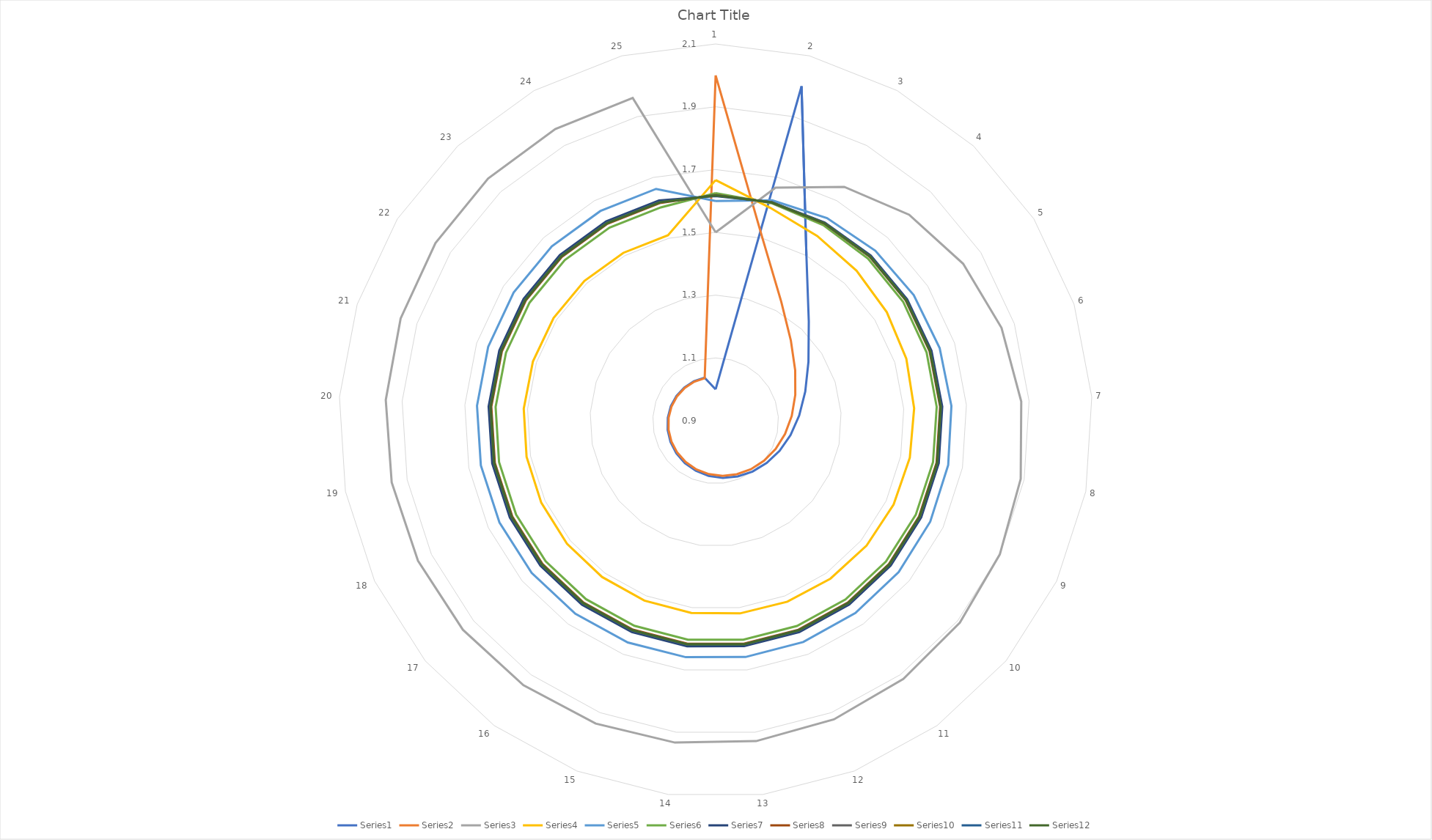
| Category | Series 0 | Series 1 | Series 2 | Series 3 | Series 4 | Series 5 | Series 6 | Series 7 | Series 8 | Series 9 | Series 10 | Series 11 |
|---|---|---|---|---|---|---|---|---|---|---|---|---|
| 0 | 1 | 2 | 1.5 | 1.667 | 1.6 | 1.625 | 1.615 | 1.619 | 1.618 | 1.618 | 1.618 | 1.618 |
| 1 | 2 | 1.5 | 1.667 | 1.6 | 1.625 | 1.615 | 1.619 | 1.618 | 1.618 | 1.618 | 1.618 | 1.618 |
| 2 | 1.5 | 1.333 | 1.75 | 1.571 | 1.636 | 1.611 | 1.621 | 1.617 | 1.618 | 1.618 | 1.618 | 1.618 |
| 3 | 1.333 | 1.25 | 1.8 | 1.556 | 1.643 | 1.609 | 1.622 | 1.617 | 1.619 | 1.618 | 1.618 | 1.618 |
| 4 | 1.25 | 1.2 | 1.833 | 1.545 | 1.647 | 1.607 | 1.622 | 1.616 | 1.619 | 1.618 | 1.618 | 1.618 |
| 5 | 1.2 | 1.167 | 1.857 | 1.538 | 1.65 | 1.606 | 1.623 | 1.616 | 1.619 | 1.618 | 1.618 | 1.618 |
| 6 | 1.167 | 1.143 | 1.875 | 1.533 | 1.652 | 1.605 | 1.623 | 1.616 | 1.619 | 1.618 | 1.618 | 1.618 |
| 7 | 1.143 | 1.125 | 1.889 | 1.529 | 1.654 | 1.605 | 1.623 | 1.616 | 1.619 | 1.618 | 1.618 | 1.618 |
| 8 | 1.125 | 1.111 | 1.9 | 1.526 | 1.655 | 1.604 | 1.623 | 1.616 | 1.619 | 1.618 | 1.618 | 1.618 |
| 9 | 1.111 | 1.1 | 1.909 | 1.524 | 1.656 | 1.604 | 1.624 | 1.616 | 1.619 | 1.618 | 1.618 | 1.618 |
| 10 | 1.1 | 1.091 | 1.917 | 1.522 | 1.657 | 1.603 | 1.624 | 1.616 | 1.619 | 1.618 | 1.618 | 1.618 |
| 11 | 1.091 | 1.083 | 1.923 | 1.52 | 1.658 | 1.603 | 1.624 | 1.616 | 1.619 | 1.618 | 1.618 | 1.618 |
| 12 | 1.083 | 1.077 | 1.929 | 1.519 | 1.659 | 1.603 | 1.624 | 1.616 | 1.619 | 1.618 | 1.618 | 1.618 |
| 13 | 1.077 | 1.071 | 1.933 | 1.517 | 1.659 | 1.603 | 1.624 | 1.616 | 1.619 | 1.618 | 1.618 | 1.618 |
| 14 | 1.071 | 1.067 | 1.938 | 1.516 | 1.66 | 1.603 | 1.624 | 1.616 | 1.619 | 1.618 | 1.618 | 1.618 |
| 15 | 1.067 | 1.062 | 1.941 | 1.515 | 1.66 | 1.602 | 1.624 | 1.616 | 1.619 | 1.618 | 1.618 | 1.618 |
| 16 | 1.062 | 1.059 | 1.944 | 1.514 | 1.66 | 1.602 | 1.624 | 1.616 | 1.619 | 1.618 | 1.618 | 1.618 |
| 17 | 1.059 | 1.056 | 1.947 | 1.514 | 1.661 | 1.602 | 1.624 | 1.616 | 1.619 | 1.618 | 1.618 | 1.618 |
| 18 | 1.056 | 1.053 | 1.95 | 1.513 | 1.661 | 1.602 | 1.624 | 1.616 | 1.619 | 1.618 | 1.618 | 1.618 |
| 19 | 1.053 | 1.05 | 1.952 | 1.512 | 1.661 | 1.602 | 1.624 | 1.616 | 1.619 | 1.618 | 1.618 | 1.618 |
| 20 | 1.05 | 1.048 | 1.955 | 1.512 | 1.662 | 1.602 | 1.624 | 1.616 | 1.619 | 1.618 | 1.618 | 1.618 |
| 21 | 1.048 | 1.045 | 1.957 | 1.511 | 1.662 | 1.602 | 1.624 | 1.616 | 1.619 | 1.618 | 1.618 | 1.618 |
| 22 | 1.045 | 1.043 | 1.958 | 1.511 | 1.662 | 1.602 | 1.624 | 1.616 | 1.619 | 1.618 | 1.618 | 1.618 |
| 23 | 1.043 | 1.042 | 1.96 | 1.51 | 1.662 | 1.602 | 1.624 | 1.616 | 1.619 | 1.618 | 1.618 | 1.618 |
| 24 | 1.042 | 1.04 | 1.962 | 1.51 | 1.662 | 1.602 | 1.624 | 1.616 | 1.619 | 1.618 | 1.618 | 1.618 |